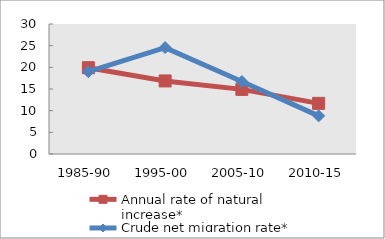
| Category | Annual rate of natural increase* | Crude net migration rate* |
|---|---|---|
| 1985-90 | 19.913 | 19.001 |
| 1995-00 | 16.86 | 24.554 |
| 2005-10 | 14.915 | 16.719 |
| 2010-15 | 11.688 | 8.798 |